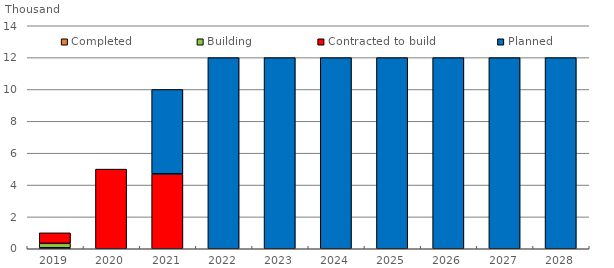
| Category | Completed | Building | Contracted to build | Planned |
|---|---|---|---|---|
| 2019.0 | 0.062 | 0.279 | 0.659 | 0 |
| 2020.0 | 0 | 0 | 5 | 0 |
| 2021.0 | 0 | 0 | 4.696 | 5.304 |
| 2022.0 | 0 | 0 | 0 | 12 |
| 2023.0 | 0 | 0 | 0 | 12 |
| 2024.0 | 0 | 0 | 0 | 12 |
| 2025.0 | 0 | 0 | 0 | 12 |
| 2026.0 | 0 | 0 | 0 | 12 |
| 2027.0 | 0 | 0 | 0 | 12 |
| 2028.0 | 0 | 0 | 0 | 12 |